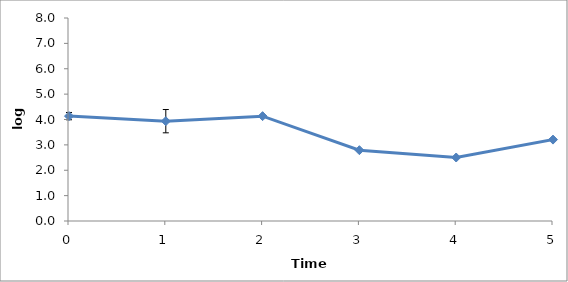
| Category | Time (w) |
|---|---|
| 0.0 | 4.133 |
| 1.0 | 3.934 |
| 2.0 | 4.132 |
| 3.0 | 2.791 |
| 4.0 | 2.502 |
| 5.0 | 3.208 |